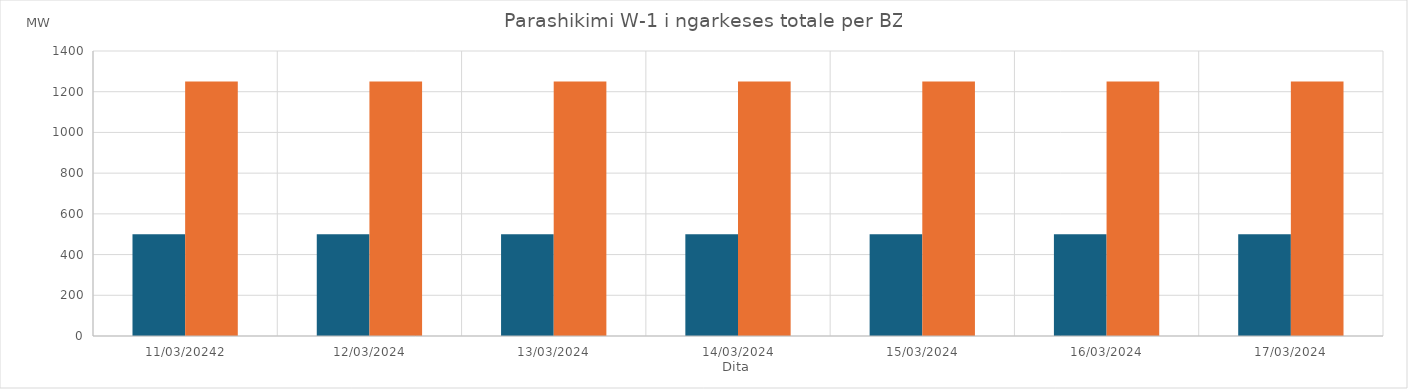
| Category | Min (MW) | Max (MW) |
|---|---|---|
| 11/03/20242 | 500 | 1250 |
| 12/03/2024 | 500 | 1250 |
| 13/03/2024 | 500 | 1250 |
| 14/03/2024 | 500 | 1250 |
| 15/03/2024 | 500 | 1250 |
| 16/03/2024 | 500 | 1250 |
| 17/03/2024 | 500 | 1250 |